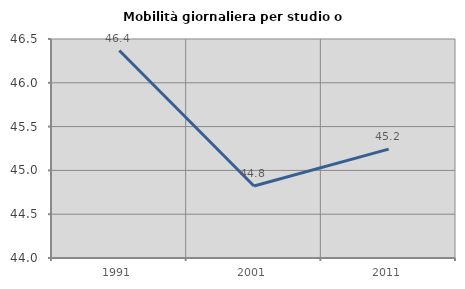
| Category | Mobilità giornaliera per studio o lavoro |
|---|---|
| 1991.0 | 46.368 |
| 2001.0 | 44.822 |
| 2011.0 | 45.243 |